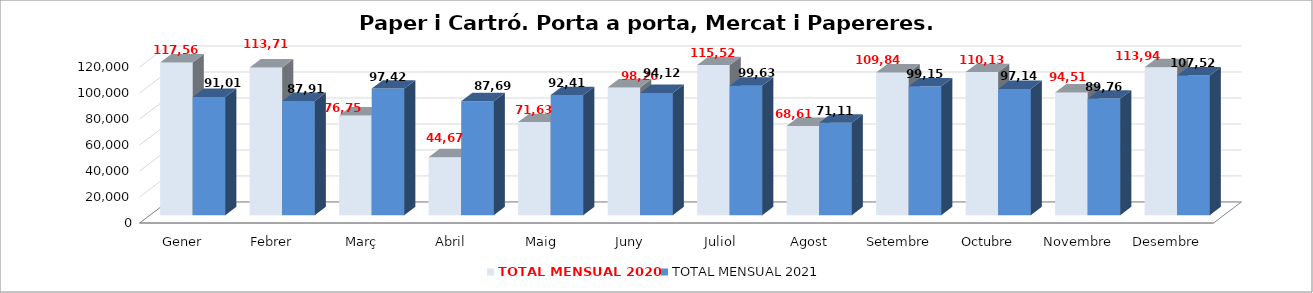
| Category | TOTAL MENSUAL 2020 | TOTAL MENSUAL 2021 |
|---|---|---|
| Gener | 117562.4 | 91010.4 |
| Febrer | 113714.2 | 87912.8 |
| Març | 76752.8 | 97429.2 |
| Abril | 44676.8 | 87691.2 |
| Maig | 71634.2 | 92410.4 |
| Juny | 98263.43 | 94128 |
| Juliol | 115521.6 | 99633.2 |
| Agost | 68613 | 71115.8 |
| Setembre | 109846.4 | 99149.97 |
| Octubre | 110135.4 | 97146.8 |
| Novembre | 94519.2 | 89768.8 |
| Desembre | 113944.8 | 107522.8 |